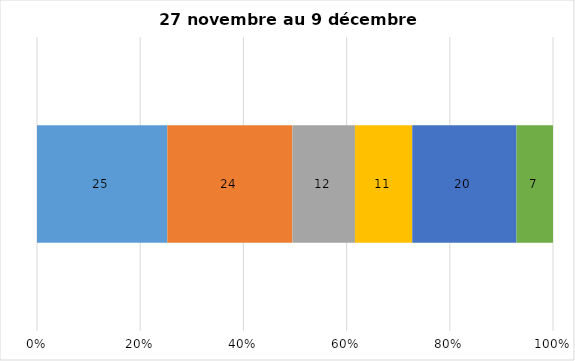
| Category | Plusieurs fois par jour | Une fois par jour | Quelques fois par semaine   | Une fois par semaine ou moins   |  Jamais   |  Je n’utilise pas les médias sociaux |
|---|---|---|---|---|---|---|
| 0 | 25 | 24 | 12 | 11 | 20 | 7 |